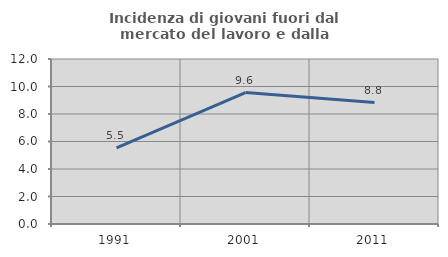
| Category | Incidenza di giovani fuori dal mercato del lavoro e dalla formazione  |
|---|---|
| 1991.0 | 5.538 |
| 2001.0 | 9.558 |
| 2011.0 | 8.829 |